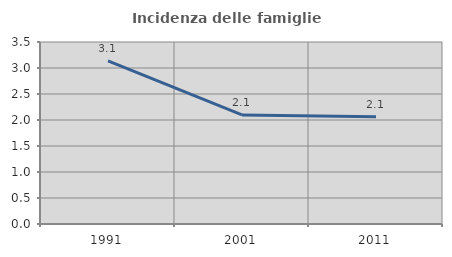
| Category | Incidenza delle famiglie numerose |
|---|---|
| 1991.0 | 3.136 |
| 2001.0 | 2.098 |
| 2011.0 | 2.062 |